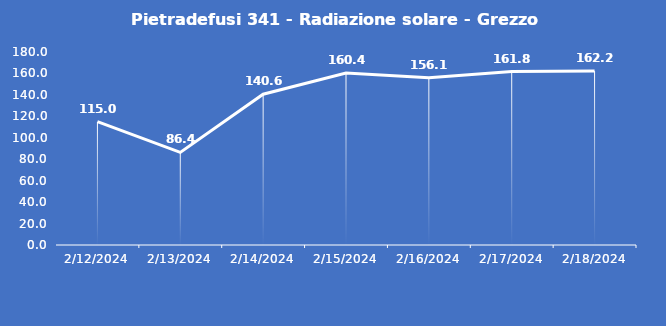
| Category | Pietradefusi 341 - Radiazione solare - Grezzo (W/m2) |
|---|---|
| 2/12/24 | 115 |
| 2/13/24 | 86.4 |
| 2/14/24 | 140.6 |
| 2/15/24 | 160.4 |
| 2/16/24 | 156.1 |
| 2/17/24 | 161.8 |
| 2/18/24 | 162.2 |